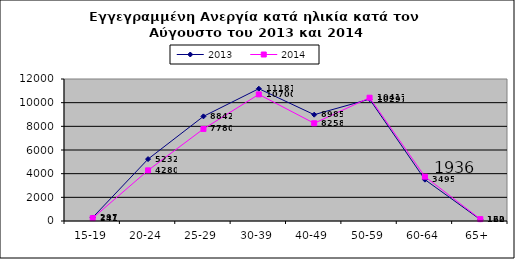
| Category | 2013 | 2014 |
|---|---|---|
| 15-19 | 297 | 241 |
| 20-24 | 5232 | 4280 |
| 25-29 | 8842 | 7780 |
| 30-39 | 11181 | 10700 |
| 40-49 | 8985 | 8258 |
| 50-59 | 10297 | 10417 |
| 60-64 | 3495 | 3747 |
| 65+ | 122 | 160 |